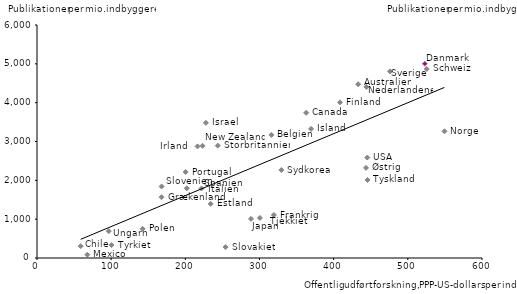
| Category | Publikationer per mio. indbyggere |
|---|---|
| 522.9 | 5001 |
| 475.9 | 4805 |
| 408.6 | 4008 |
| 445.6 | 2009 |
| 433.0 | 4476 |
| 329.5 | 2266 |
| 525.5 | 4867 |
| 443.6 | 2321 |
| 444.1 | 4406 |
| 300.5 | 1033 |
| 234.1 | 1394 |
| 362.9 | 3739 |
| 549.4 | 3263 |
| 445.3 | 2587 |
| 288.5 | 1008 |
| 319.4 | 1107 |
| 369.6 | 3325 |
| 316.1 | 3170 |
| 200.4 | 2214 |
| 227.7 | 3480 |
| 223.2 | 2889 |
| 221.8 | 1790 |
| 201.9 | 1795 |
| 243.7 | 2894 |
| 254.2 | 281 |
| 168.0 | 1842 |
| 167.9 | 1566 |
| 142.4 | 751 |
| 100.5 | 333 |
| 216.5 | 2874 |
| 96.8 | 691 |
| 58.9 | 306 |
| 67.9 | 86 |